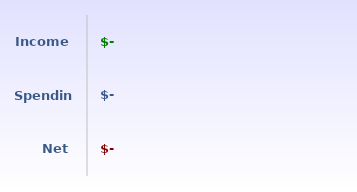
| Category | Series 2 |
|---|---|
| Net | 0 |
| Spending | 0 |
| Income | 0 |